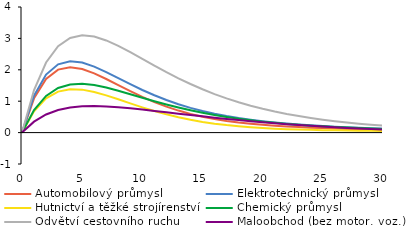
| Category | Automobilový průmysl | Elektrotechnický průmysl | Hutnictví a těžké strojírenství | Chemický průmysl | Odvětví cestovního ruchu | Maloobchod (bez motor. voz.) |
|---|---|---|---|---|---|---|
| 0.0 | 0 | 0 | 0 | 0 | 0 | 0 |
| 1.0 | 1.092 | 1.177 | 0.68 | 0.72 | 1.357 | 0.349 |
| 2.0 | 1.711 | 1.848 | 1.09 | 1.168 | 2.232 | 0.578 |
| 3.0 | 2.005 | 2.174 | 1.305 | 1.42 | 2.752 | 0.72 |
| 4.0 | 2.084 | 2.273 | 1.383 | 1.534 | 3.016 | 0.801 |
| 5.0 | 2.026 | 2.229 | 1.368 | 1.555 | 3.099 | 0.839 |
| 6.0 | 1.887 | 2.1 | 1.295 | 1.515 | 3.058 | 0.847 |
| 7.0 | 1.707 | 1.927 | 1.186 | 1.436 | 2.935 | 0.835 |
| 8.0 | 1.512 | 1.735 | 1.061 | 1.335 | 2.762 | 0.809 |
| 9.0 | 1.318 | 1.542 | 0.931 | 1.224 | 2.561 | 0.774 |
| 10.0 | 1.136 | 1.358 | 0.805 | 1.11 | 2.348 | 0.734 |
| 11.0 | 0.971 | 1.189 | 0.687 | 1 | 2.134 | 0.692 |
| 12.0 | 0.826 | 1.037 | 0.581 | 0.895 | 1.926 | 0.648 |
| 13.0 | 0.701 | 0.903 | 0.489 | 0.798 | 1.73 | 0.603 |
| 14.0 | 0.595 | 0.787 | 0.409 | 0.71 | 1.547 | 0.56 |
| 15.0 | 0.506 | 0.687 | 0.341 | 0.631 | 1.379 | 0.517 |
| 16.0 | 0.433 | 0.601 | 0.285 | 0.56 | 1.227 | 0.476 |
| 17.0 | 0.372 | 0.527 | 0.238 | 0.497 | 1.089 | 0.437 |
| 18.0 | 0.322 | 0.464 | 0.201 | 0.442 | 0.966 | 0.399 |
| 19.0 | 0.281 | 0.411 | 0.17 | 0.392 | 0.856 | 0.364 |
| 20.0 | 0.247 | 0.365 | 0.146 | 0.349 | 0.758 | 0.33 |
| 21.0 | 0.218 | 0.325 | 0.126 | 0.311 | 0.671 | 0.299 |
| 22.0 | 0.195 | 0.29 | 0.11 | 0.278 | 0.594 | 0.269 |
| 23.0 | 0.175 | 0.26 | 0.097 | 0.248 | 0.525 | 0.241 |
| 24.0 | 0.158 | 0.234 | 0.087 | 0.222 | 0.465 | 0.216 |
| 25.0 | 0.143 | 0.21 | 0.079 | 0.198 | 0.411 | 0.192 |
| 26.0 | 0.13 | 0.189 | 0.072 | 0.178 | 0.364 | 0.17 |
| 27.0 | 0.118 | 0.171 | 0.065 | 0.16 | 0.322 | 0.15 |
| 28.0 | 0.108 | 0.154 | 0.06 | 0.143 | 0.285 | 0.132 |
| 29.0 | 0.098 | 0.139 | 0.055 | 0.129 | 0.252 | 0.115 |
| 30.0 | 0.089 | 0.126 | 0.051 | 0.115 | 0.223 | 0.1 |